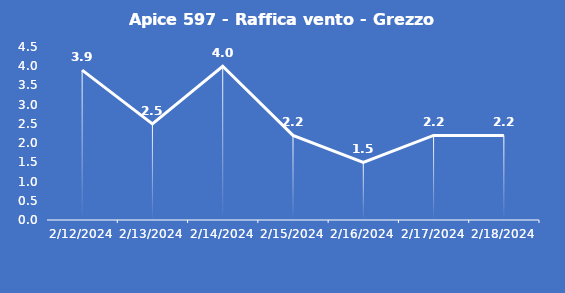
| Category | Apice 597 - Raffica vento - Grezzo (m/s) |
|---|---|
| 2/12/24 | 3.9 |
| 2/13/24 | 2.5 |
| 2/14/24 | 4 |
| 2/15/24 | 2.2 |
| 2/16/24 | 1.5 |
| 2/17/24 | 2.2 |
| 2/18/24 | 2.2 |